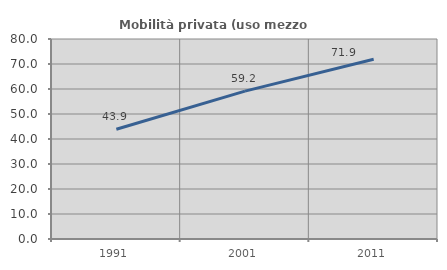
| Category | Mobilità privata (uso mezzo privato) |
|---|---|
| 1991.0 | 43.885 |
| 2001.0 | 59.167 |
| 2011.0 | 71.92 |